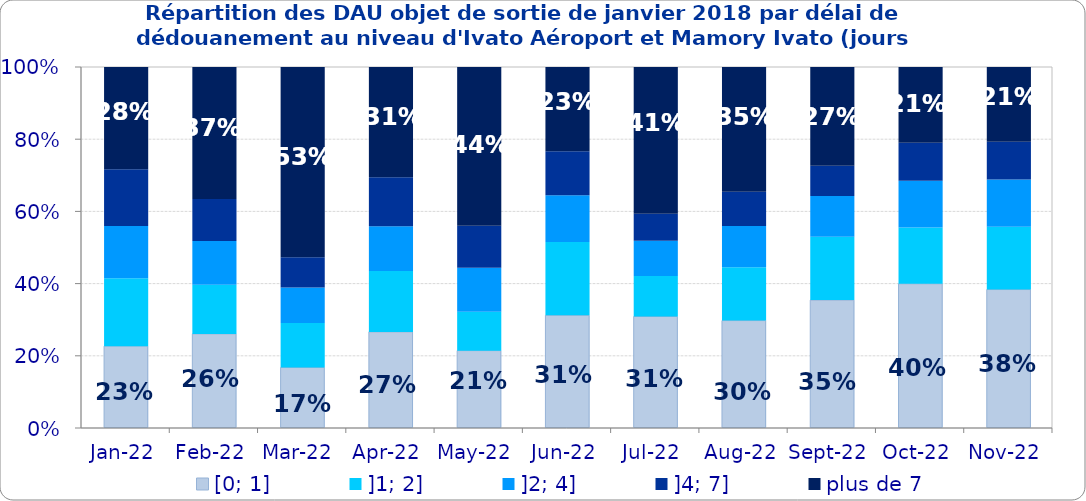
| Category | [0; 1] | ]1; 2] | ]2; 4] | ]4; 7] | plus de 7 |
|---|---|---|---|---|---|
| 2022-01-01 | 0.227 | 0.188 | 0.145 | 0.158 | 0.283 |
| 2022-02-01 | 0.261 | 0.136 | 0.121 | 0.116 | 0.366 |
| 2022-03-01 | 0.168 | 0.123 | 0.098 | 0.083 | 0.527 |
| 2022-04-01 | 0.266 | 0.169 | 0.124 | 0.136 | 0.305 |
| 2022-05-01 | 0.214 | 0.108 | 0.122 | 0.116 | 0.44 |
| 2022-06-01 | 0.312 | 0.203 | 0.129 | 0.122 | 0.233 |
| 2022-07-01 | 0.309 | 0.112 | 0.098 | 0.074 | 0.407 |
| 2022-08-01 | 0.298 | 0.148 | 0.114 | 0.095 | 0.345 |
| 2022-09-01 | 0.354 | 0.175 | 0.113 | 0.084 | 0.273 |
| 2022-10-01 | 0.399 | 0.156 | 0.13 | 0.105 | 0.21 |
| 2022-11-01 | 0.384 | 0.174 | 0.131 | 0.104 | 0.207 |